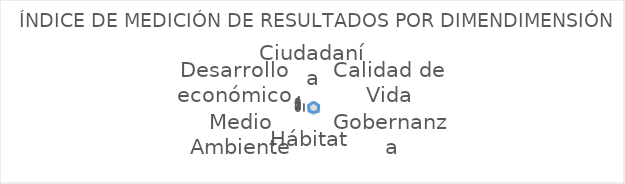
| Category | Series 0 |
|---|---|
| Ciudadanía | 4.154 |
| Calidad de Vida | 3.818 |
| Gobernanza | 3.5 |
| Hábitat | 2.54 |
| Medio Ambiente | 3.133 |
| Desarrollo económico | 3.75 |